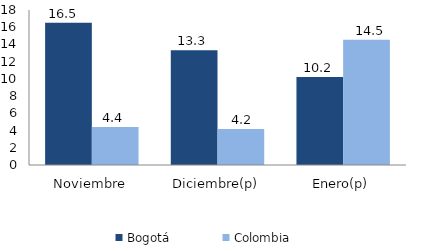
| Category | Bogotá | Colombia |
|---|---|---|
| Noviembre | 16.515 | 4.401 |
| Diciembre(p) | 13.316 | 4.182 |
| Enero(p) | 10.209 | 14.545 |